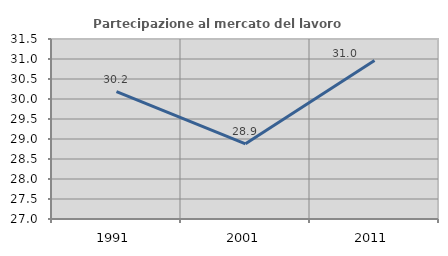
| Category | Partecipazione al mercato del lavoro  femminile |
|---|---|
| 1991.0 | 30.187 |
| 2001.0 | 28.878 |
| 2011.0 | 30.965 |